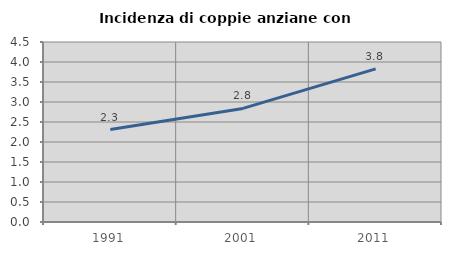
| Category | Incidenza di coppie anziane con figli |
|---|---|
| 1991.0 | 2.31 |
| 2001.0 | 2.839 |
| 2011.0 | 3.827 |